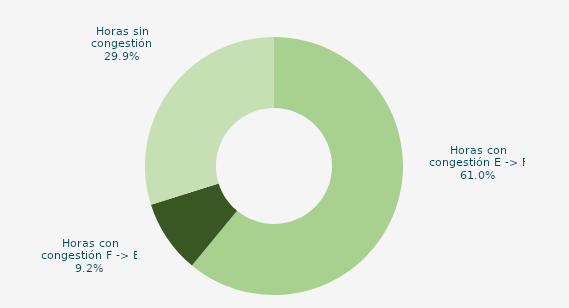
| Category | Horas con congestión E -> F |
|---|---|
| Horas con congestión E -> F | 60.972 |
| Horas con congestión F -> E | 9.167 |
| Horas sin congestión | 29.861 |